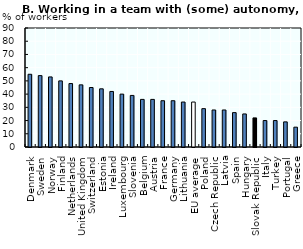
| Category | Series 0 |
|---|---|
| Denmark | 55 |
| Sweden | 54 |
| Norway | 53 |
| Finland | 50 |
| Netherlands | 48 |
| United Kingdom | 47 |
| Switzerland | 45 |
| Estonia | 44 |
| Ireland | 42 |
| Luxembourg | 40 |
| Slovenia | 39 |
| Belgium | 36 |
| Austria | 36 |
| France | 35 |
| Germany | 35 |
| Lithuania | 34 |
| EU average | 34 |
| Poland | 29 |
| Czech Republic | 28 |
| Latvia | 28 |
| Spain | 26 |
| Hungary | 25 |
| Slovak Republic | 22 |
| Italy | 20 |
| Turkey | 20 |
| Portugal | 19 |
| Greece | 15 |